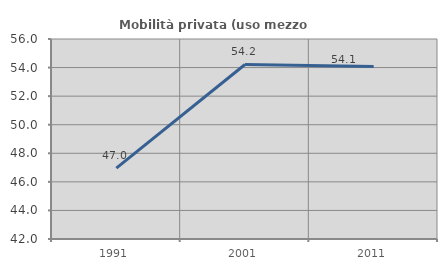
| Category | Mobilità privata (uso mezzo privato) |
|---|---|
| 1991.0 | 46.957 |
| 2001.0 | 54.217 |
| 2011.0 | 54.082 |